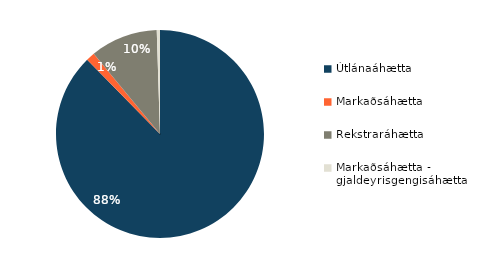
| Category | Series 0 |
|---|---|
| Útlánaáhætta | 0.876 |
| Markaðsáhætta | 0.014 |
| Rekstraráhætta | 0.105 |
| Markaðsáhætta - gjaldeyrisgengisáhætta | 0.005 |